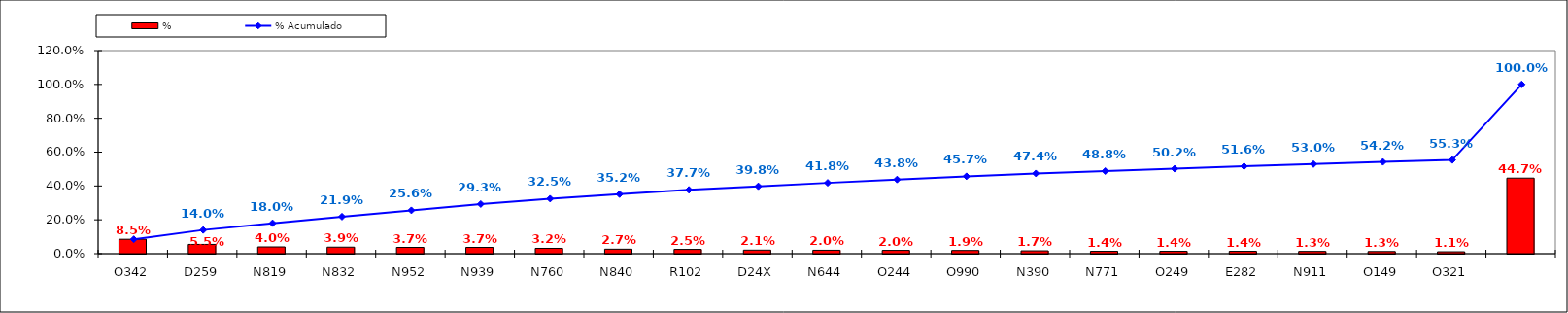
| Category | % |
|---|---|
| O342 | 0.085 |
| D259 | 0.055 |
| N819 | 0.04 |
| N832 | 0.039 |
| N952 | 0.037 |
| N939 | 0.037 |
| N760 | 0.032 |
| N840 | 0.027 |
| R102 | 0.025 |
| D24X | 0.021 |
| N644 | 0.02 |
| O244 | 0.02 |
| O990 | 0.019 |
| N390 | 0.017 |
| N771 | 0.014 |
| O249 | 0.014 |
| E282 | 0.014 |
| N911 | 0.013 |
| O149 | 0.013 |
| O321 | 0.011 |